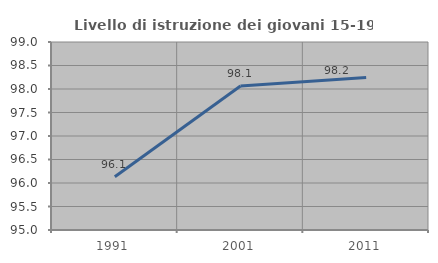
| Category | Livello di istruzione dei giovani 15-19 anni |
|---|---|
| 1991.0 | 96.133 |
| 2001.0 | 98.065 |
| 2011.0 | 98.246 |